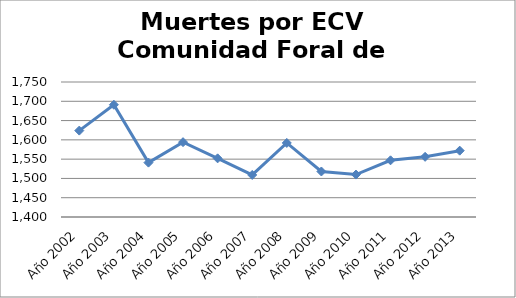
| Category | Series 0 |
|---|---|
| Año 2002 | 1624 |
| Año 2003 | 1691 |
| Año 2004 | 1541 |
| Año 2005 | 1594 |
| Año 2006 | 1552 |
| Año 2007 | 1509 |
| Año 2008 | 1592 |
| Año 2009 | 1518 |
| Año 2010 | 1510 |
| Año 2011 | 1547 |
| Año 2012 | 1556 |
| Año 2013 | 1572 |